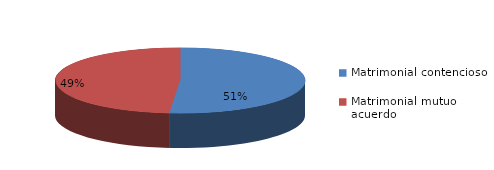
| Category | Series 0 |
|---|---|
| 0 | 706 |
| 1 | 669 |